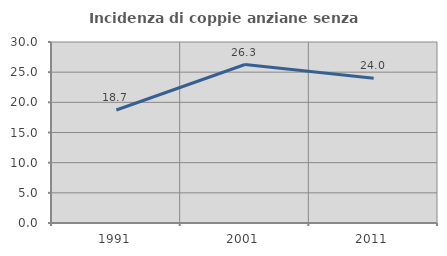
| Category | Incidenza di coppie anziane senza figli  |
|---|---|
| 1991.0 | 18.729 |
| 2001.0 | 26.266 |
| 2011.0 | 23.991 |